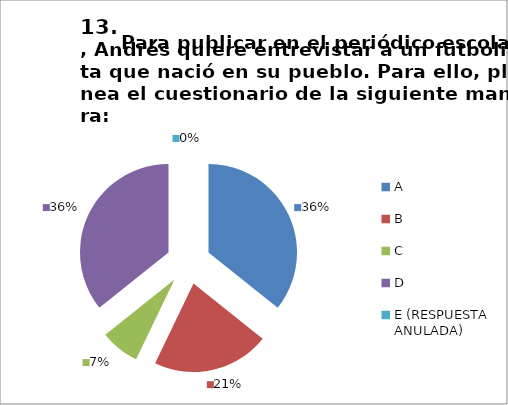
| Category | CANTIDAD DE RESPUESTAS PREGUNTA (13) | PORCENTAJE |
|---|---|---|
| A | 10 | 0.357 |
| B | 6 | 0.214 |
| C | 2 | 0.071 |
| D | 10 | 0.357 |
| E (RESPUESTA ANULADA) | 0 | 0 |